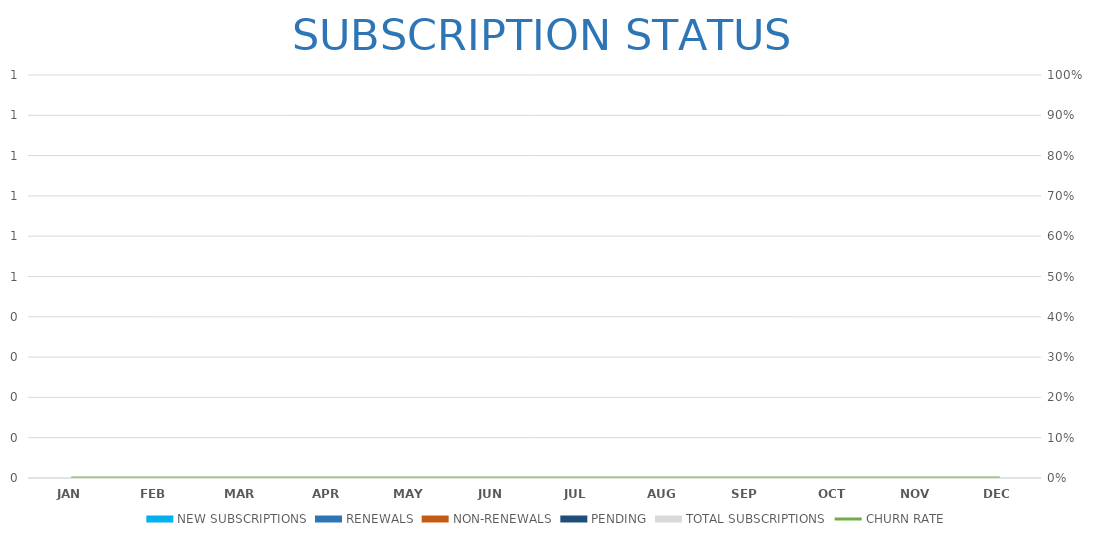
| Category | NEW SUBSCRIPTIONS | RENEWALS | NON-RENEWALS | PENDING | TOTAL SUBSCRIPTIONS |
|---|---|---|---|---|---|
| JAN | 0 | 0 | 0 | 0 | 0 |
| FEB | 0 | 0 | 0 | 0 | 0 |
| MAR | 0 | 0 | 0 | 0 | 0 |
| APR | 0 | 0 | 0 | 0 | 0 |
| MAY | 0 | 0 | 0 | 0 | 0 |
| JUN | 0 | 0 | 0 | 0 | 0 |
| JUL | 0 | 0 | 0 | 0 | 0 |
| AUG | 0 | 0 | 0 | 0 | 0 |
| SEP | 0 | 0 | 0 | 0 | 0 |
| OCT | 0 | 0 | 0 | 0 | 0 |
| NOV | 0 | 0 | 0 | 0 | 0 |
| DEC | 0 | 0 | 0 | 0 | 0 |